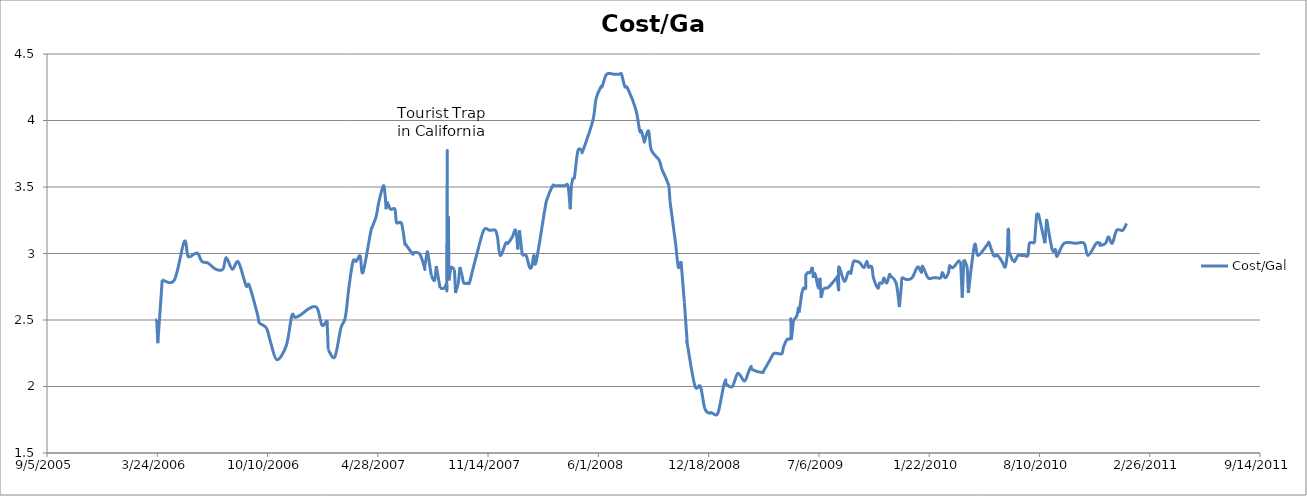
| Category | Cost/Gal |
|---|---|
| 38796.0 | 2.5 |
| 38799.0 | 2.5 |
| 38801.0 | 2.326 |
| 38809.0 | 2.801 |
| 38831.0 | 2.801 |
| 38849.0 | 3.09 |
| 38856.0 | 2.978 |
| 38868.0 | 2.999 |
| 38874.0 | 2.999 |
| 38881.0 | 2.94 |
| 38892.0 | 2.928 |
| 38906.0 | 2.882 |
| 38919.0 | 2.882 |
| 38925.0 | 2.969 |
| 38936.0 | 2.882 |
| 38947.0 | 2.936 |
| 38961.0 | 2.759 |
| 38967.0 | 2.759 |
| 38982.0 | 2.538 |
| 38985.0 | 2.479 |
| 38998.0 | 2.439 |
| 39006.0 | 2.326 |
| 39017.0 | 2.202 |
| 39034.0 | 2.308 |
| 39044.0 | 2.532 |
| 39050.0 | 2.519 |
| 39060.0 | 2.538 |
| 39073.0 | 2.58 |
| 39084.0 | 2.601 |
| 39091.0 | 2.581 |
| 39099.0 | 2.46 |
| 39108.0 | 2.498 |
| 39110.0 | 2.277 |
| 39122.0 | 2.222 |
| 39133.0 | 2.439 |
| 39141.0 | 2.519 |
| 39148.0 | 2.759 |
| 39155.0 | 2.941 |
| 39161.0 | 2.941 |
| 39168.0 | 2.981 |
| 39173.0 | 2.857 |
| 39187.0 | 3.161 |
| 39190.0 | 3.2 |
| 39197.0 | 3.279 |
| 39202.0 | 3.39 |
| 39210.0 | 3.509 |
| 39213.0 | 3.448 |
| 39215.0 | 3.333 |
| 39217.0 | 3.39 |
| 39223.0 | 3.333 |
| 39231.0 | 3.333 |
| 39234.0 | 3.233 |
| 39243.0 | 3.226 |
| 39249.0 | 3.077 |
| 39250.0 | 3.072 |
| 39263.0 | 2.996 |
| 39264.0 | 3.006 |
| 39276.0 | 2.996 |
| 39285.0 | 2.89 |
| 39285.0 | 2.899 |
| 39290.0 | 3.021 |
| 39297.0 | 2.834 |
| 39303.0 | 2.798 |
| 39306.0 | 2.905 |
| 39313.0 | 2.74 |
| 39320.0 | 2.738 |
| 39325.0 | 2.778 |
| 39325.0 | 2.794 |
| 39326.0 | 3.774 |
| 39326.0 | 3.004 |
| 39328.0 | 3.279 |
| 39329.0 | 2.797 |
| 39332.0 | 2.885 |
| 39334.0 | 2.899 |
| 39339.0 | 2.878 |
| 39341.0 | 2.703 |
| 39346.0 | 2.778 |
| 39349.0 | 2.899 |
| 39353.0 | 2.832 |
| 39356.0 | 2.778 |
| 39363.0 | 2.778 |
| 39366.0 | 2.778 |
| 39371.0 | 2.857 |
| 39379.0 | 2.985 |
| 39392.0 | 3.175 |
| 39402.0 | 3.175 |
| 39405.0 | 3.175 |
| 39413.0 | 3.175 |
| 39417.0 | 3.125 |
| 39422.0 | 2.985 |
| 39432.0 | 3.077 |
| 39436.0 | 3.077 |
| 39444.0 | 3.125 |
| 39450.0 | 3.175 |
| 39454.0 | 3.03 |
| 39457.0 | 3.175 |
| 39462.0 | 2.985 |
| 39469.0 | 2.985 |
| 39475.0 | 2.899 |
| 39479.0 | 2.899 |
| 39483.0 | 2.985 |
| 39487.0 | 2.936 |
| 39503.0 | 3.333 |
| 39507.0 | 3.409 |
| 39517.0 | 3.509 |
| 39520.0 | 3.509 |
| 39525.0 | 3.509 |
| 39529.0 | 3.509 |
| 39532.0 | 3.509 |
| 39539.0 | 3.509 |
| 39545.0 | 3.509 |
| 39549.0 | 3.333 |
| 39551.0 | 3.509 |
| 39554.0 | 3.571 |
| 39556.0 | 3.571 |
| 39557.0 | 3.585 |
| 39563.0 | 3.774 |
| 39570.0 | 3.774 |
| 39572.0 | 3.774 |
| 39590.0 | 4 |
| 39596.0 | 4.167 |
| 39605.0 | 4.255 |
| 39607.0 | 4.255 |
| 39615.0 | 4.348 |
| 39628.0 | 4.348 |
| 39631.0 | 4.348 |
| 39634.0 | 4.348 |
| 39639.0 | 4.348 |
| 39642.0 | 4.348 |
| 39648.0 | 4.255 |
| 39653.0 | 4.243 |
| 39668.0 | 4.082 |
| 39675.0 | 3.922 |
| 39678.0 | 3.922 |
| 39683.0 | 3.846 |
| 39684.0 | 3.846 |
| 39691.0 | 3.922 |
| 39696.0 | 3.778 |
| 39710.0 | 3.704 |
| 39715.0 | 3.636 |
| 39722.0 | 3.571 |
| 39728.0 | 3.509 |
| 39730.0 | 3.389 |
| 39740.0 | 3.077 |
| 39745.0 | 2.899 |
| 39750.0 | 2.941 |
| 39756.0 | 2.632 |
| 39761.0 | 2.338 |
| 39761.0 | 2.328 |
| 39775.0 | 2.006 |
| 39785.0 | 2 |
| 39793.0 | 1.835 |
| 39801.0 | 1.8 |
| 39805.0 | 1.805 |
| 39808.0 | 1.797 |
| 39817.0 | 1.802 |
| 39827.0 | 2 |
| 39831.0 | 2.049 |
| 39832.0 | 2.019 |
| 39843.0 | 2 |
| 39853.0 | 2.099 |
| 39865.0 | 2.041 |
| 39872.0 | 2.105 |
| 39877.0 | 2.151 |
| 39879.0 | 2.128 |
| 39897.0 | 2.105 |
| 39900.0 | 2.119 |
| 39911.0 | 2.198 |
| 39918.0 | 2.247 |
| 39926.0 | 2.247 |
| 39933.0 | 2.247 |
| 39936.0 | 2.299 |
| 39942.0 | 2.353 |
| 39949.0 | 2.369 |
| 39949.0 | 2.51 |
| 39950.0 | 2.353 |
| 39954.0 | 2.5 |
| 39960.0 | 2.532 |
| 39963.0 | 2.599 |
| 39964.0 | 2.555 |
| 39969.0 | 2.703 |
| 39972.0 | 2.74 |
| 39976.0 | 2.74 |
| 39976.0 | 2.832 |
| 39978.0 | 2.847 |
| 39980.0 | 2.857 |
| 39984.0 | 2.857 |
| 39988.0 | 2.899 |
| 39990.0 | 2.817 |
| 39992.0 | 2.857 |
| 39995.0 | 2.817 |
| 39999.0 | 2.74 |
| 40002.0 | 2.817 |
| 40004.0 | 2.667 |
| 40008.0 | 2.74 |
| 40012.0 | 2.74 |
| 40018.0 | 2.749 |
| 40032.0 | 2.817 |
| 40033.0 | 2.818 |
| 40036.0 | 2.727 |
| 40036.0 | 2.899 |
| 40046.0 | 2.792 |
| 40053.0 | 2.857 |
| 40057.0 | 2.857 |
| 40058.0 | 2.851 |
| 40060.0 | 2.895 |
| 40063.0 | 2.941 |
| 40068.0 | 2.941 |
| 40074.0 | 2.931 |
| 40080.0 | 2.899 |
| 40083.0 | 2.899 |
| 40087.0 | 2.941 |
| 40090.0 | 2.899 |
| 40091.0 | 2.899 |
| 40096.0 | 2.899 |
| 40099.0 | 2.817 |
| 40107.0 | 2.74 |
| 40110.0 | 2.778 |
| 40115.0 | 2.778 |
| 40118.0 | 2.817 |
| 40123.0 | 2.778 |
| 40128.0 | 2.841 |
| 40130.0 | 2.832 |
| 40140.0 | 2.778 |
| 40146.0 | 2.597 |
| 40150.0 | 2.778 |
| 40151.0 | 2.817 |
| 40159.0 | 2.804 |
| 40169.0 | 2.817 |
| 40179.0 | 2.899 |
| 40186.0 | 2.857 |
| 40188.0 | 2.904 |
| 40198.0 | 2.817 |
| 40207.0 | 2.817 |
| 40214.0 | 2.817 |
| 40221.0 | 2.817 |
| 40224.0 | 2.857 |
| 40229.0 | 2.817 |
| 40235.0 | 2.857 |
| 40237.0 | 2.908 |
| 40243.0 | 2.893 |
| 40253.0 | 2.941 |
| 40257.0 | 2.941 |
| 40260.0 | 2.668 |
| 40263.0 | 2.954 |
| 40265.0 | 2.941 |
| 40269.0 | 2.899 |
| 40271.0 | 2.703 |
| 40282.0 | 3.06 |
| 40288.0 | 2.985 |
| 40299.0 | 3.03 |
| 40307.0 | 3.077 |
| 40309.0 | 3.077 |
| 40317.0 | 2.985 |
| 40324.0 | 2.985 |
| 40332.0 | 2.941 |
| 40338.0 | 2.899 |
| 40342.0 | 3 |
| 40342.0 | 3 |
| 40343.0 | 3.188 |
| 40344.0 | 3.188 |
| 40345.0 | 3.01 |
| 40352.0 | 2.941 |
| 40355.0 | 2.941 |
| 40361.0 | 2.985 |
| 40367.0 | 2.985 |
| 40373.0 | 2.985 |
| 40379.0 | 2.985 |
| 40382.0 | 3.077 |
| 40391.0 | 3.077 |
| 40395.0 | 3.301 |
| 40398.0 | 3.302 |
| 40410.0 | 3.077 |
| 40413.0 | 3.259 |
| 40423.0 | 3.03 |
| 40429.0 | 3.03 |
| 40430.0 | 3.003 |
| 40431.0 | 2.985 |
| 40433.0 | 2.985 |
| 40445.0 | 3.077 |
| 40466.0 | 3.077 |
| 40481.0 | 3.077 |
| 40488.0 | 2.985 |
| 40503.0 | 3.077 |
| 40508.0 | 3.077 |
| 40510.0 | 3.079 |
| 40510.0 | 3.061 |
| 40520.0 | 3.077 |
| 40525.0 | 3.125 |
| 40532.0 | 3.077 |
| 40540.0 | 3.175 |
| 40551.0 | 3.175 |
| 40558.0 | 3.226 |